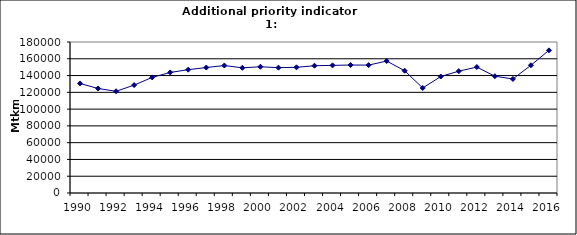
| Category | Freight transport on road, Mtkm |
|---|---|
| 1990 | 130600 |
| 1991 | 124592 |
| 1992 | 121250 |
| 1993 | 128625 |
| 1994 | 137811 |
| 1995 | 143700 |
| 1996 | 147000 |
| 1997 | 149557 |
| 1998 | 151931 |
| 1999 | 149225 |
| 2000 | 150482 |
| 2001 | 149398 |
| 2002 | 149826 |
| 2003 | 151711 |
| 2004 | 152126 |
| 2005 | 152566 |
| 2006 | 152445 |
| 2007 | 157311 |
| 2008 | 145760 |
| 2009 | 125177 |
| 2010 | 138850 |
| 2011 | 145223 |
| 2012 | 150140 |
| 2013 | 139224 |
| 2014 | 135938 |
| 2015 | 152269 |
| 2016 | 170045 |